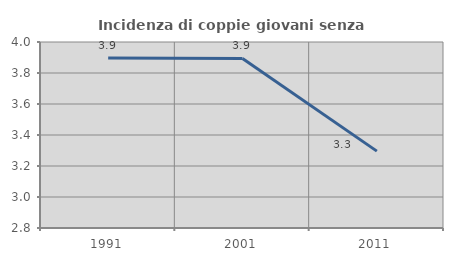
| Category | Incidenza di coppie giovani senza figli |
|---|---|
| 1991.0 | 3.896 |
| 2001.0 | 3.894 |
| 2011.0 | 3.296 |